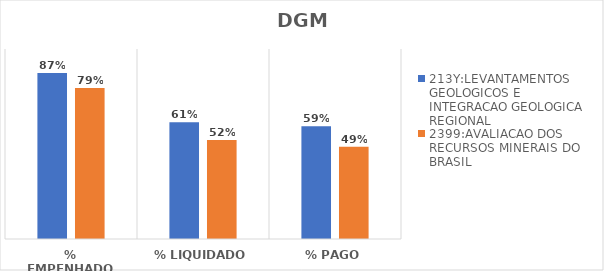
| Category | 213Y:LEVANTAMENTOS GEOLOGICOS E INTEGRACAO GEOLOGICA REGIONAL | 2399:AVALIACAO DOS RECURSOS MINERAIS DO BRASIL |
|---|---|---|
| % EMPENHADO | 0.874 | 0.795 |
| % LIQUIDADO | 0.614 | 0.522 |
| % PAGO | 0.593 | 0.485 |